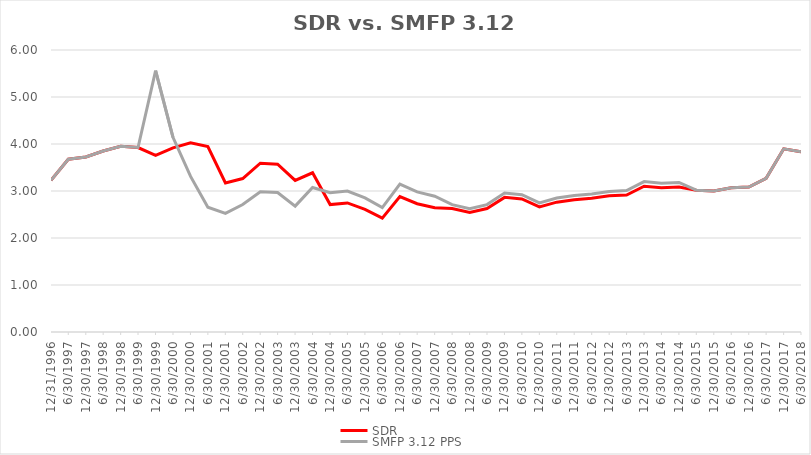
| Category | SDR | SMFP 3.12 PPS |
|---|---|---|
| 12/31/96 | 3.225 | 3.225 |
| 6/30/97 | 3.675 | 3.675 |
| 12/31/97 | 3.725 | 3.725 |
| 6/30/98 | 3.85 | 3.85 |
| 12/31/98 | 3.95 | 3.95 |
| 6/30/99 | 3.925 | 3.925 |
| 12/31/99 | 3.757 | 5.56 |
| 6/30/00 | 3.919 | 4.143 |
| 12/31/00 | 4.027 | 3.311 |
| 6/30/01 | 3.946 | 2.655 |
| 12/31/01 | 3.17 | 2.525 |
| 6/30/02 | 3.265 | 2.712 |
| 12/31/02 | 3.592 | 2.983 |
| 6/30/03 | 3.571 | 2.966 |
| 12/31/03 | 3.224 | 2.678 |
| 6/30/04 | 3.388 | 3.074 |
| 12/31/04 | 2.712 | 2.963 |
| 6/30/05 | 2.746 | 3 |
| 12/31/05 | 2.61 | 2.852 |
| 6/30/06 | 2.424 | 2.648 |
| 12/31/06 | 2.881 | 3.148 |
| 6/30/07 | 2.729 | 2.981 |
| 12/31/07 | 2.644 | 2.889 |
| 6/30/08 | 2.627 | 2.711 |
| 12/31/08 | 2.542 | 2.623 |
| 6/30/09 | 2.627 | 2.711 |
| 12/31/09 | 2.864 | 2.956 |
| 6/30/10 | 2.831 | 2.921 |
| 12/31/10 | 2.661 | 2.746 |
| 6/30/11 | 2.763 | 2.851 |
| 12/31/11 | 2.814 | 2.903 |
| 6/30/12 | 2.847 | 2.938 |
| 12/31/12 | 2.898 | 2.991 |
| 6/30/13 | 2.915 | 3.008 |
| 12/31/13 | 3.102 | 3.201 |
| 6/30/14 | 3.068 | 3.166 |
| 12/31/14 | 3.085 | 3.183 |
| 6/30/15 | 3.017 | 3.017 |
| 12/31/15 | 3 | 3 |
| 6/30/16 | 3.068 | 3.068 |
| 12/31/16 | 3.085 | 3.085 |
| 6/30/17 | 3.271 | 3.271 |
| 12/31/17 | 3.898 | 3.898 |
| 6/30/18 | 3.837 | 3.837 |